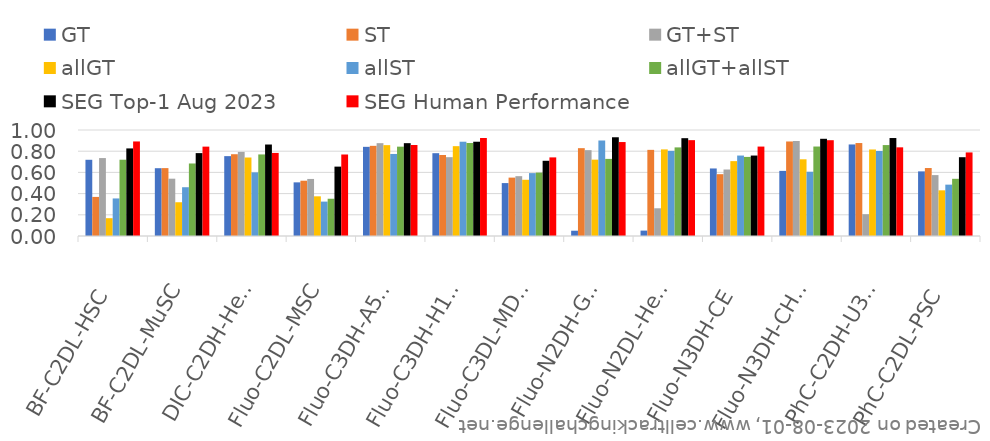
| Category | GT | ST | GT+ST | allGT | allST | allGT+allST | SEG Top-1 Aug 2023 | SEG Human Performance |
|---|---|---|---|---|---|---|---|---|
| BF-C2DL-HSC | 0.719 | 0.369 | 0.735 | 0.168 | 0.354 | 0.72 | 0.826 | 0.892 |
| BF-C2DL-MuSC | 0.64 | 0.64 | 0.541 | 0.318 | 0.46 | 0.684 | 0.782 | 0.843 |
| DIC-C2DH-HeLa | 0.753 | 0.771 | 0.794 | 0.741 | 0.6 | 0.769 | 0.863 | 0.784 |
| Fluo-C2DL-MSC | 0.506 | 0.522 | 0.538 | 0.374 | 0.324 | 0.352 | 0.655 | 0.769 |
| Fluo-C3DH-A549 | 0.841 | 0.851 | 0.876 | 0.857 | 0.774 | 0.843 | 0.876 | 0.859 |
| Fluo-C3DH-H157 | 0.781 | 0.764 | 0.744 | 0.847 | 0.889 | 0.878 | 0.889 | 0.924 |
| Fluo-C3DL-MDA231 | 0.499 | 0.551 | 0.564 | 0.53 | 0.593 | 0.598 | 0.71 | 0.742 |
| Fluo-N2DH-GOWT1 | 0.05 | 0.829 | 0.81 | 0.72 | 0.901 | 0.727 | 0.931 | 0.886 |
| Fluo-N2DL-HeLa | 0.051 | 0.813 | 0.262 | 0.817 | 0.803 | 0.836 | 0.923 | 0.904 |
| Fluo-N3DH-CE | 0.637 | 0.583 | 0.627 | 0.706 | 0.759 | 0.746 | 0.759 | 0.844 |
| Fluo-N3DH-CHO | 0.614 | 0.892 | 0.897 | 0.724 | 0.606 | 0.844 | 0.917 | 0.904 |
| PhC-C2DH-U373 | 0.864 | 0.877 | 0.206 | 0.816 | 0.802 | 0.858 | 0.924 | 0.836 |
| PhC-C2DL-PSC | 0.61 | 0.641 | 0.575 | 0.431 | 0.484 | 0.54 | 0.743 | 0.788 |